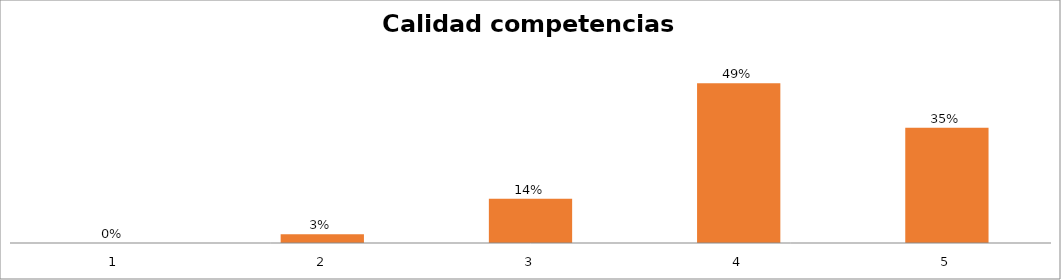
| Category | Series 1 |
|---|---|
| 0 | 0 |
| 1 | 0.027 |
| 2 | 0.135 |
| 3 | 0.486 |
| 4 | 0.351 |